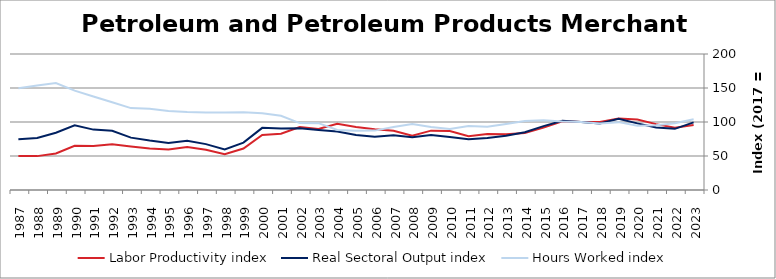
| Category | Labor Productivity index | Real Sectoral Output index | Hours Worked index |
|---|---|---|---|
| 2023.0 | 95.738 | 99.51 | 103.94 |
| 2022.0 | 91.725 | 89.927 | 98.039 |
| 2021.0 | 96.853 | 92.056 | 95.046 |
| 2020.0 | 103.614 | 97.987 | 94.569 |
| 2019.0 | 104.978 | 104.76 | 99.792 |
| 2018.0 | 100.076 | 97.771 | 97.697 |
| 2017.0 | 100 | 100 | 100 |
| 2016.0 | 101.19 | 101.91 | 100.712 |
| 2015.0 | 91.67 | 93.932 | 102.467 |
| 2014.0 | 83.663 | 85.023 | 101.625 |
| 2013.0 | 82.043 | 79.684 | 97.124 |
| 2012.0 | 82.433 | 76.547 | 92.859 |
| 2011.0 | 79.203 | 74.492 | 94.053 |
| 2010.0 | 86.689 | 77.843 | 89.796 |
| 2009.0 | 87.29 | 81.007 | 92.803 |
| 2008.0 | 79.968 | 77.504 | 96.919 |
| 2007.0 | 87.109 | 80.573 | 92.497 |
| 2006.0 | 89.505 | 78.164 | 87.329 |
| 2005.0 | 92.685 | 80.886 | 87.27 |
| 2004.0 | 97.404 | 85.996 | 88.288 |
| 2003.0 | 89.744 | 88.238 | 98.321 |
| 2002.0 | 92.466 | 90.953 | 98.364 |
| 2001.0 | 82.822 | 90.381 | 109.127 |
| 2000.0 | 80.997 | 91.387 | 112.828 |
| 1999.0 | 60.929 | 69.648 | 114.309 |
| 1998.0 | 52.463 | 59.701 | 113.796 |
| 1997.0 | 59.126 | 67.49 | 114.146 |
| 1996.0 | 63.245 | 72.457 | 114.564 |
| 1995.0 | 59.511 | 69.116 | 116.141 |
| 1994.0 | 60.953 | 72.722 | 119.308 |
| 1993.0 | 63.969 | 77.023 | 120.406 |
| 1992.0 | 67.426 | 86.98 | 129 |
| 1991.0 | 64.549 | 88.811 | 137.588 |
| 1990.0 | 65.029 | 95.03 | 146.134 |
| 1989.0 | 53.627 | 84.284 | 157.167 |
| 1988.0 | 49.823 | 76.482 | 153.508 |
| 1987.0 | 49.956 | 74.715 | 149.562 |